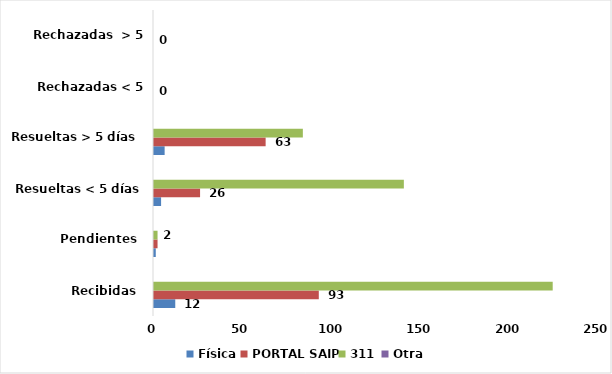
| Category | Física | PORTAL SAIP | 311 | Otra |
|---|---|---|---|---|
| Recibidas  | 12 | 93 | 225 | 0 |
| Pendientes  | 1 | 2 | 2 | 0 |
| Resueltas < 5 días | 4 | 26 | 141 | 0 |
| Resueltas > 5 días  | 6 | 63 | 84 | 0 |
| Rechazadas < 5 días  | 0 | 0 | 0 | 0 |
| Rechazadas  > 5 días | 0 | 0 | 0 | 0 |